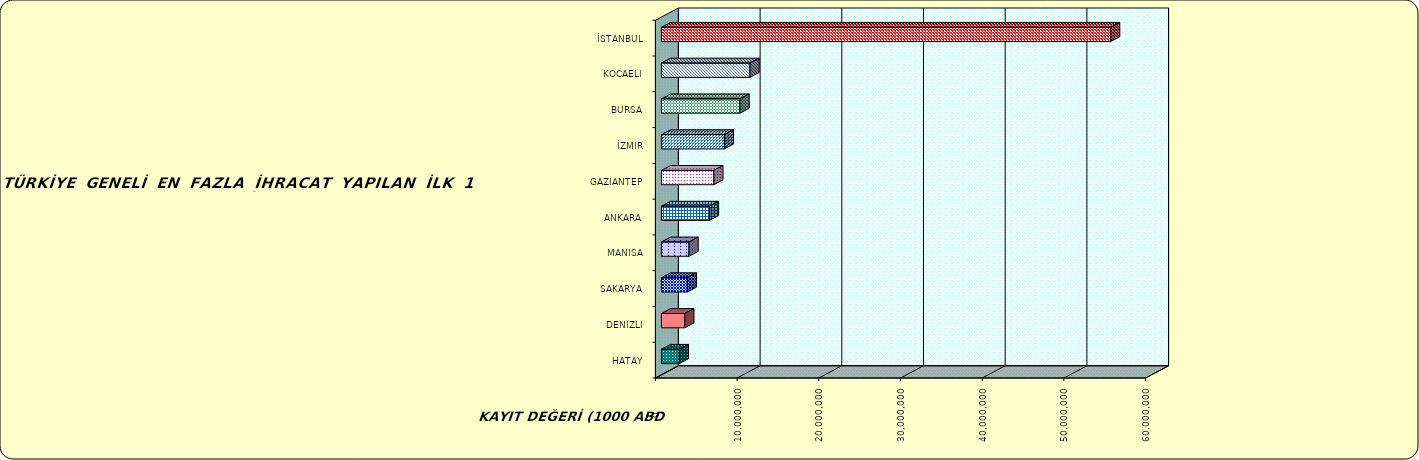
| Category | Series 0 |
|---|---|
| İSTANBUL | 54989343.65 |
| KOCAELI | 10845038.877 |
| BURSA | 9622446.693 |
| İZMIR | 7707800.036 |
| GAZIANTEP | 6418855.056 |
| ANKARA | 5877326.832 |
| MANISA | 3379316.394 |
| SAKARYA | 3175786.085 |
| DENIZLI | 2865411.185 |
| HATAY | 2192379.007 |